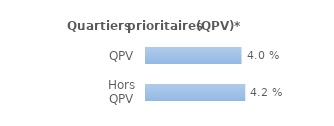
| Category | Series 0 |
|---|---|
| QPV | 0.04 |
| Hors QPV | 0.042 |